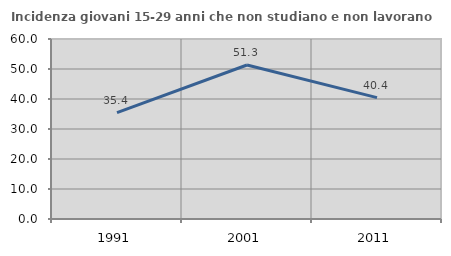
| Category | Incidenza giovani 15-29 anni che non studiano e non lavorano  |
|---|---|
| 1991.0 | 35.445 |
| 2001.0 | 51.334 |
| 2011.0 | 40.447 |